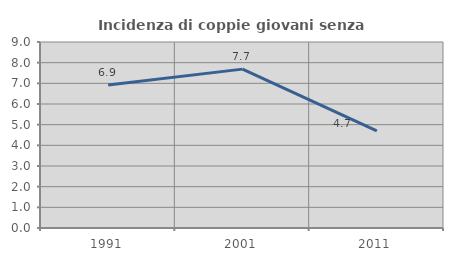
| Category | Incidenza di coppie giovani senza figli |
|---|---|
| 1991.0 | 6.924 |
| 2001.0 | 7.688 |
| 2011.0 | 4.703 |